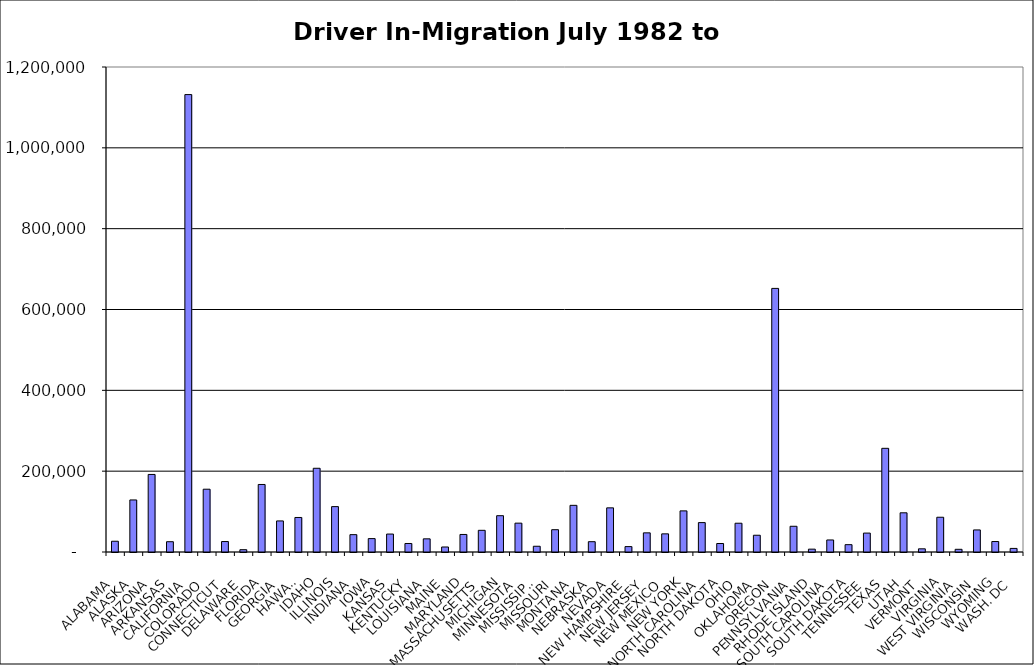
| Category | Series 0 |
|---|---|
| ALABAMA | 26630.5 |
| ALASKA | 128810.5 |
| ARIZONA | 191869 |
| ARKANSAS | 25461.5 |
| CALIFORNIA | 1131737.5 |
| COLORADO | 155360 |
| CONNECTICUT | 25890 |
| DELAWARE | 5684.5 |
| FLORIDA | 167054 |
| GEORGIA | 76867 |
| HAWAII | 85413.5 |
| IDAHO | 207155.5 |
| ILLINOIS | 112292.5 |
| INDIANA | 42934 |
| IOWA | 33135.5 |
| KANSAS | 44393.5 |
| KENTUCKY | 21055 |
| LOUISIANA | 32560.5 |
| MAINE | 12379.5 |
| MARYLAND | 43412 |
| MASSACHUSETTS | 53636 |
| MICHIGAN | 89839 |
| MINNESOTA | 71383.5 |
| MISSISSIPPI | 14221 |
| MISSOURI | 55175 |
| MONTANA | 115443 |
| NEBRASKA | 25484.5 |
| NEVADA | 109251 |
| NEW HAMPSHIRE | 13357.5 |
| NEW JERSEY | 47396 |
| NEW MEXICO | 44921 |
| NEW YORK | 101735 |
| NORTH CAROLINA | 72730.5 |
| NORTH DAKOTA | 21007.5 |
| OHIO | 71179.5 |
| OKLAHOMA | 41446 |
| OREGON | 652219 |
| PENNSYLVANIA | 63671.5 |
| RHODE ISLAND | 7058 |
| SOUTH CAROLINA | 29771.5 |
| SOUTH DAKOTA | 18156.5 |
| TENNESSEE | 46795.5 |
| TEXAS | 256517 |
| UTAH | 96988.5 |
| VERMONT | 7883 |
| VIRGINIA | 85985 |
| WEST VIRGINIA | 6662.5 |
| WISCONSIN | 54595.5 |
| WYOMING | 25927 |
| WASH. DC | 8882 |